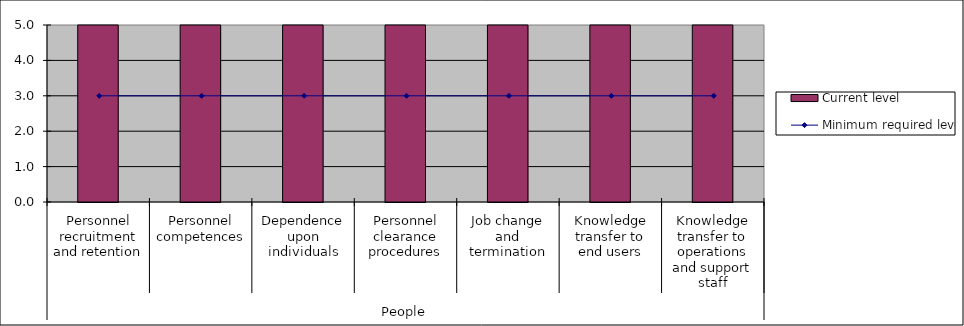
| Category | Current level |
|---|---|
| 0 | 5 |
| 1 | 5 |
| 2 | 5 |
| 3 | 5 |
| 4 | 5 |
| 5 | 5 |
| 6 | 5 |